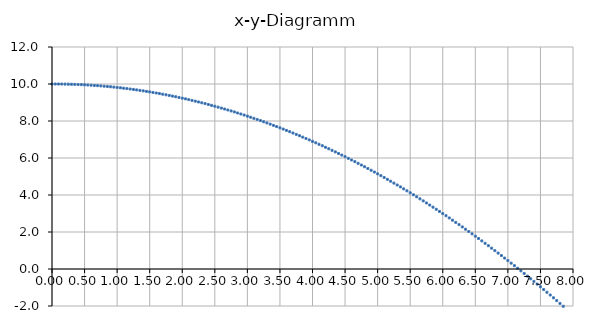
| Category | Series 0 |
|---|---|
| 0.0 | 10 |
| 0.05 | 10 |
| 0.1 | 9.999 |
| 0.15 | 9.997 |
| 0.2 | 9.994 |
| 0.25 | 9.99 |
| 0.3 | 9.985 |
| 0.35 | 9.979 |
| 0.4 | 9.973 |
| 0.45 | 9.965 |
| 0.5 | 9.956 |
| 0.55 | 9.946 |
| 0.6 | 9.935 |
| 0.65 | 9.923 |
| 0.7 | 9.911 |
| 0.75 | 9.897 |
| 0.8 | 9.882 |
| 0.85 | 9.867 |
| 0.9 | 9.85 |
| 0.95 | 9.832 |
| 1.0 | 9.814 |
| 1.05 | 9.794 |
| 1.1 | 9.773 |
| 1.15 | 9.752 |
| 1.2 | 9.729 |
| 1.25 | 9.706 |
| 1.3 | 9.681 |
| 1.35 | 9.656 |
| 1.4 | 9.629 |
| 1.45 | 9.602 |
| 1.5 | 9.573 |
| 1.55 | 9.544 |
| 1.6 | 9.513 |
| 1.65 | 9.482 |
| 1.7 | 9.45 |
| 1.75 | 9.416 |
| 1.8 | 9.382 |
| 1.85 | 9.347 |
| 1.9 | 9.31 |
| 1.95 | 9.273 |
| 2.0 | 9.235 |
| 2.05 | 9.196 |
| 2.1 | 9.155 |
| 2.15 | 9.114 |
| 2.2 | 9.072 |
| 2.25 | 9.029 |
| 2.3 | 8.985 |
| 2.35 | 8.94 |
| 2.4 | 8.893 |
| 2.45 | 8.846 |
| 2.5 | 8.798 |
| 2.55 | 8.749 |
| 2.6 | 8.699 |
| 2.65 | 8.648 |
| 2.7 | 8.596 |
| 2.75 | 8.543 |
| 2.8 | 8.489 |
| 2.85 | 8.434 |
| 2.9 | 8.378 |
| 2.95 | 8.322 |
| 3.0 | 8.264 |
| 3.05 | 8.205 |
| 3.1 | 8.145 |
| 3.15 | 8.084 |
| 3.2 | 8.022 |
| 3.25 | 7.96 |
| 3.3 | 7.896 |
| 3.35 | 7.831 |
| 3.4 | 7.765 |
| 3.45 | 7.699 |
| 3.5 | 7.631 |
| 3.55 | 7.562 |
| 3.6 | 7.493 |
| 3.64999999999999 | 7.422 |
| 3.69999999999999 | 7.35 |
| 3.74999999999999 | 7.278 |
| 3.79999999999999 | 7.204 |
| 3.84999999999999 | 7.13 |
| 3.89999999999999 | 7.054 |
| 3.94999999999999 | 6.978 |
| 3.99999999999999 | 6.9 |
| 4.04999999999999 | 6.822 |
| 4.09999999999999 | 6.742 |
| 4.14999999999999 | 6.662 |
| 4.19999999999999 | 6.58 |
| 4.24999999999999 | 6.498 |
| 4.29999999999999 | 6.414 |
| 4.34999999999999 | 6.33 |
| 4.39999999999999 | 6.245 |
| 4.44999999999999 | 6.158 |
| 4.49999999999999 | 6.071 |
| 4.54999999999999 | 5.983 |
| 4.59999999999999 | 5.894 |
| 4.64999999999999 | 5.803 |
| 4.69999999999999 | 5.712 |
| 4.74999999999999 | 5.62 |
| 4.79999999999999 | 5.527 |
| 4.84999999999999 | 5.432 |
| 4.89999999999999 | 5.337 |
| 4.94999999999999 | 5.241 |
| 4.99999999999999 | 5.144 |
| 5.04999999999999 | 5.046 |
| 5.09999999999999 | 4.947 |
| 5.14999999999999 | 4.847 |
| 5.19999999999999 | 4.746 |
| 5.24999999999999 | 4.644 |
| 5.29999999999999 | 4.541 |
| 5.34999999999999 | 4.437 |
| 5.39999999999999 | 4.332 |
| 5.44999999999999 | 4.226 |
| 5.49999999999999 | 4.119 |
| 5.54999999999999 | 4.011 |
| 5.59999999999999 | 3.902 |
| 5.64999999999999 | 3.792 |
| 5.69999999999999 | 3.681 |
| 5.74999999999999 | 3.57 |
| 5.79999999999999 | 3.457 |
| 5.84999999999999 | 3.343 |
| 5.89999999999999 | 3.228 |
| 5.94999999999999 | 3.112 |
| 5.99999999999999 | 2.996 |
| 6.04999999999999 | 2.878 |
| 6.09999999999999 | 2.759 |
| 6.14999999999999 | 2.64 |
| 6.19999999999999 | 2.519 |
| 6.24999999999999 | 2.397 |
| 6.29999999999999 | 2.275 |
| 6.34999999999999 | 2.151 |
| 6.39999999999999 | 2.026 |
| 6.44999999999999 | 1.901 |
| 6.49999999999999 | 1.774 |
| 6.54999999999999 | 1.647 |
| 6.59999999999998 | 1.518 |
| 6.64999999999998 | 1.389 |
| 6.69999999999998 | 1.258 |
| 6.74999999999998 | 1.127 |
| 6.79999999999998 | 0.994 |
| 6.84999999999998 | 0.861 |
| 6.89999999999998 | 0.727 |
| 6.94999999999998 | 0.591 |
| 6.99999999999998 | 0.455 |
| 7.04999999999998 | 0.318 |
| 7.09999999999998 | 0.179 |
| 7.14999999999998 | 0.04 |
| 7.19999999999998 | -0.1 |
| 7.24999999999998 | -0.242 |
| 7.29999999999998 | -0.384 |
| 7.34999999999998 | -0.527 |
| 7.39999999999998 | -0.671 |
| 7.44999999999998 | -0.817 |
| 7.49999999999998 | -0.963 |
| 7.54999999999998 | -1.11 |
| 7.59999999999998 | -1.258 |
| 7.64999999999998 | -1.407 |
| 7.69999999999998 | -1.557 |
| 7.74999999999998 | -1.708 |
| 7.79999999999998 | -1.86 |
| 7.84999999999998 | -2.013 |
| 7.89999999999998 | -2.167 |
| 7.94999999999998 | -2.322 |
| 7.99999999999998 | -2.478 |